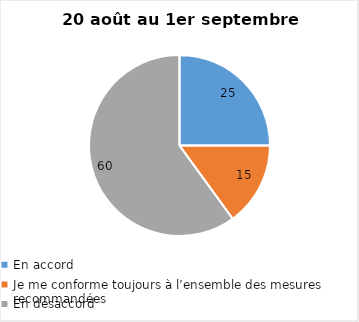
| Category | Series 0 |
|---|---|
| En accord | 25 |
| Je me conforme toujours à l’ensemble des mesures recommandées | 15 |
| En désaccord | 60 |